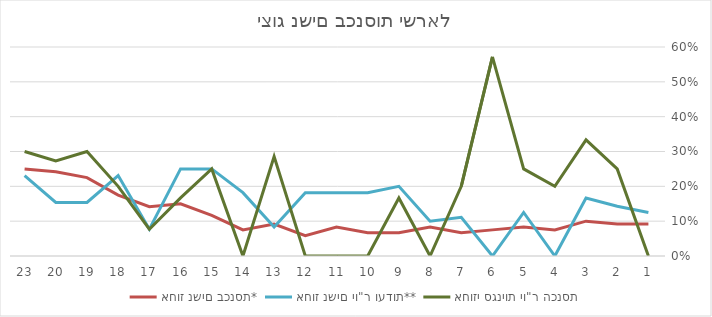
| Category | אחוז נשים בכנסת* | אחוז נשים יו"ר ועדות** | אחוזי סגניות יו"ר הכנסת |
|---|---|---|---|
| 1.0 | 0.092 | 0.125 | 0 |
| 2.0 | 0.092 | 0.143 | 0.25 |
| 3.0 | 0.1 | 0.167 | 0.333 |
| 4.0 | 0.075 | 0 | 0.2 |
| 5.0 | 0.083 | 0.125 | 0.25 |
| 6.0 | 0.075 | 0 | 0.571 |
| 7.0 | 0.067 | 0.111 | 0.2 |
| 8.0 | 0.083 | 0.1 | 0 |
| 9.0 | 0.067 | 0.2 | 0.167 |
| 10.0 | 0.067 | 0.182 | 0 |
| 11.0 | 0.083 | 0.182 | 0 |
| 12.0 | 0.058 | 0.182 | 0 |
| 13.0 | 0.092 | 0.083 | 0.286 |
| 14.0 | 0.075 | 0.182 | 0 |
| 15.0 | 0.117 | 0.25 | 0.25 |
| 16.0 | 0.15 | 0.25 | 0.167 |
| 17.0 | 0.142 | 0.077 | 0.077 |
| 18.0 | 0.175 | 0.231 | 0.2 |
| 19.0 | 0.225 | 0.154 | 0.3 |
| 20.0 | 0.242 | 0.154 | 0.273 |
| 23.0 | 0.25 | 0.231 | 0.3 |